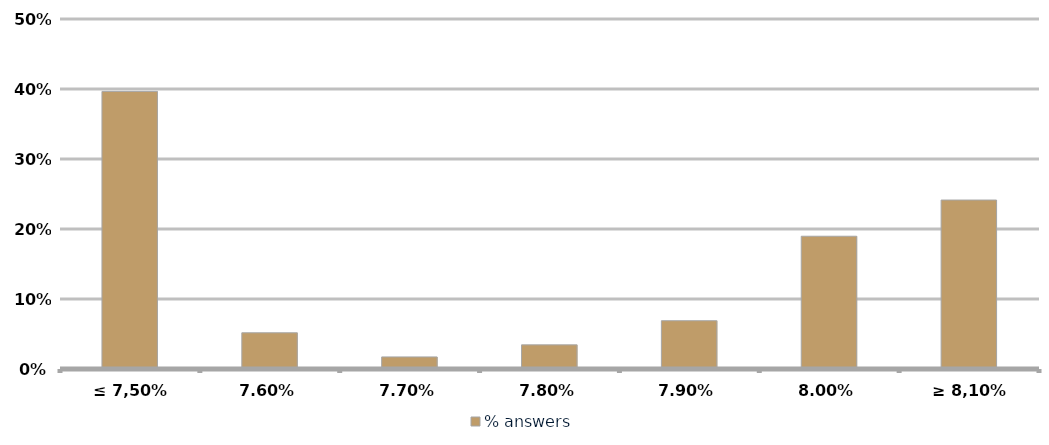
| Category | % answers |
|---|---|
| ≤ 7,50% | 0.397 |
| 7,60% | 0.052 |
| 7,70% | 0.017 |
| 7,80% | 0.034 |
| 7,90% | 0.069 |
| 8,00% | 0.19 |
| ≥ 8,10% | 0.241 |